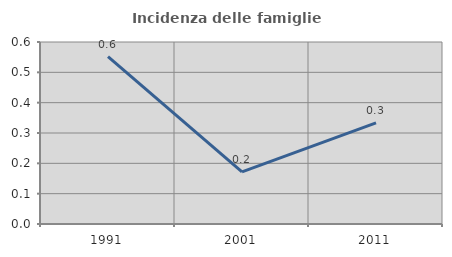
| Category | Incidenza delle famiglie numerose |
|---|---|
| 1991.0 | 0.551 |
| 2001.0 | 0.172 |
| 2011.0 | 0.333 |